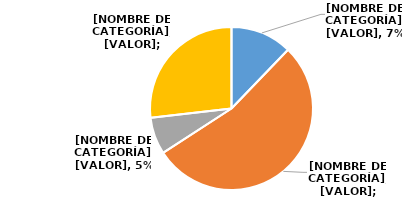
| Category | Series 0 |
|---|---|
| Esposo | 5 |
| Conviviente | 22 |
| Pareja sexual sin hijos | 3 |
| Enamorado/novio que no es pareja sexual | 11 |